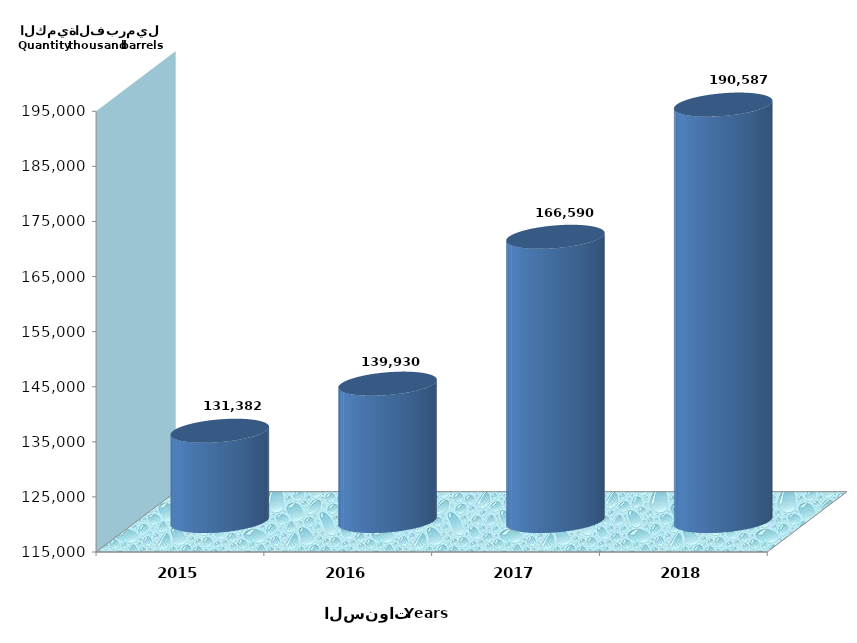
| Category | Series 0 |
|---|---|
| 2015 | 131382069 |
| 2016 | 139929733 |
| 2017 | 166590059.344 |
| 2018 | 190586727.136 |